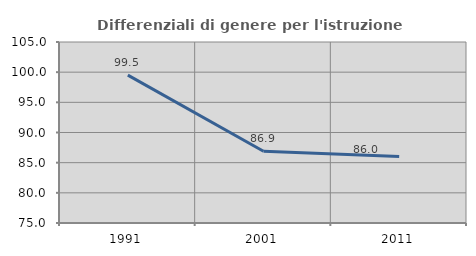
| Category | Differenziali di genere per l'istruzione superiore |
|---|---|
| 1991.0 | 99.509 |
| 2001.0 | 86.884 |
| 2011.0 | 86.004 |